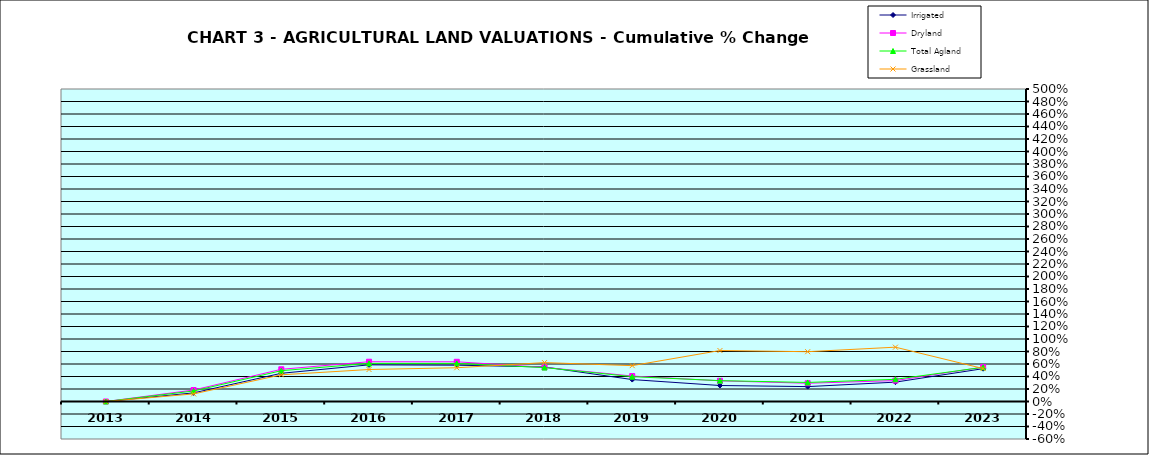
| Category | Irrigated | Dryland | Total Agland | Grassland |
|---|---|---|---|---|
| 2013.0 | 0 | 0 | 0 | 0 |
| 2014.0 | 0.138 | 0.183 | 0.168 | 0.122 |
| 2015.0 | 0.451 | 0.515 | 0.493 | 0.427 |
| 2016.0 | 0.586 | 0.636 | 0.61 | 0.512 |
| 2017.0 | 0.581 | 0.635 | 0.609 | 0.54 |
| 2018.0 | 0.552 | 0.546 | 0.543 | 0.622 |
| 2019.0 | 0.351 | 0.407 | 0.397 | 0.574 |
| 2020.0 | 0.256 | 0.331 | 0.334 | 0.816 |
| 2021.0 | 0.238 | 0.292 | 0.305 | 0.797 |
| 2022.0 | 0.31 | 0.335 | 0.355 | 0.869 |
| 2023.0 | 0.525 | 0.551 | 0.547 | 0.527 |